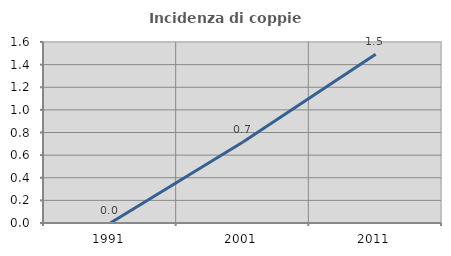
| Category | Incidenza di coppie miste |
|---|---|
| 1991.0 | 0 |
| 2001.0 | 0.717 |
| 2011.0 | 1.493 |